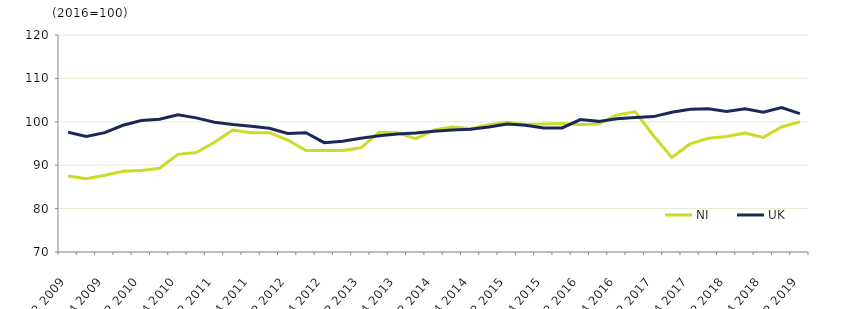
| Category | NI | UK  |
|---|---|---|
| Q2 2009 | 87.5 | 97.6 |
|  | 86.9 | 96.6 |
| Q4 2009 | 87.7 | 97.5 |
|  | 88.6 | 99.2 |
| Q2 2010 | 88.8 | 100.3 |
|  | 89.3 | 100.6 |
| Q4 2010 | 92.5 | 101.6 |
|  | 92.9 | 100.9 |
| Q2 2011 | 95.3 | 99.9 |
|  | 98.1 | 99.4 |
| Q4 2011 | 97.5 | 99 |
|  | 97.5 | 98.5 |
| Q2 2012 | 95.8 | 97.3 |
|  | 93.4 | 97.5 |
| Q4 2012 | 93.4 | 95.2 |
|  | 93.4 | 95.5 |
| Q2 2013 | 94 | 96.2 |
|  | 97.6 | 96.8 |
| Q4 2013 | 97.5 | 97.2 |
|  | 96.1 | 97.4 |
| Q2 2014 | 98.1 | 97.8 |
|  | 98.8 | 98.1 |
| Q4 2014 | 98.4 | 98.3 |
|  | 99.3 | 98.8 |
| Q2 2015 | 99.9 | 99.5 |
|  | 99.4 | 99.2 |
| Q4 2015 | 99.5 | 98.6 |
|  | 99.6 | 98.6 |
| Q2 2016 | 99.4 | 100.5 |
|  | 99.5 | 100.1 |
| Q4 2016 | 101.6 | 100.7 |
|  | 102.3 | 101 |
| Q2 2017 | 96.8 | 101.2 |
|  | 91.8 | 102.2 |
| Q4 2017 | 94.9 | 102.9 |
|  | 96.2 | 103 |
| Q2 2018 | 96.6 | 102.4 |
|  | 97.4 | 103 |
| Q4 2018 | 96.4 | 102.2 |
|  | 98.8 | 103.3 |
| Q2 2019 | 100 | 101.9 |